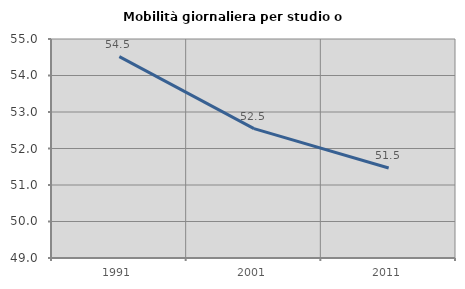
| Category | Mobilità giornaliera per studio o lavoro |
|---|---|
| 1991.0 | 54.518 |
| 2001.0 | 52.545 |
| 2011.0 | 51.464 |